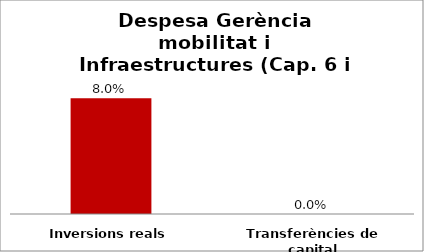
| Category | Series 0 |
|---|---|
| Inversions reals | 0.08 |
| Transferències de capital | 0 |